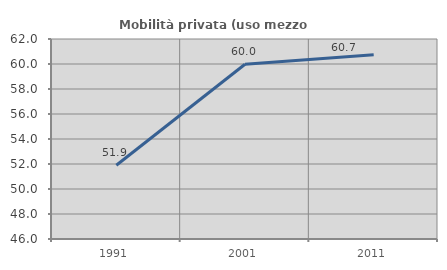
| Category | Mobilità privata (uso mezzo privato) |
|---|---|
| 1991.0 | 51.899 |
| 2001.0 | 59.979 |
| 2011.0 | 60.731 |